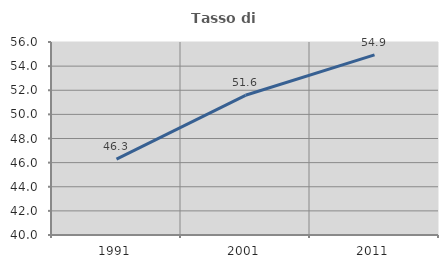
| Category | Tasso di occupazione   |
|---|---|
| 1991.0 | 46.284 |
| 2001.0 | 51.582 |
| 2011.0 | 54.938 |